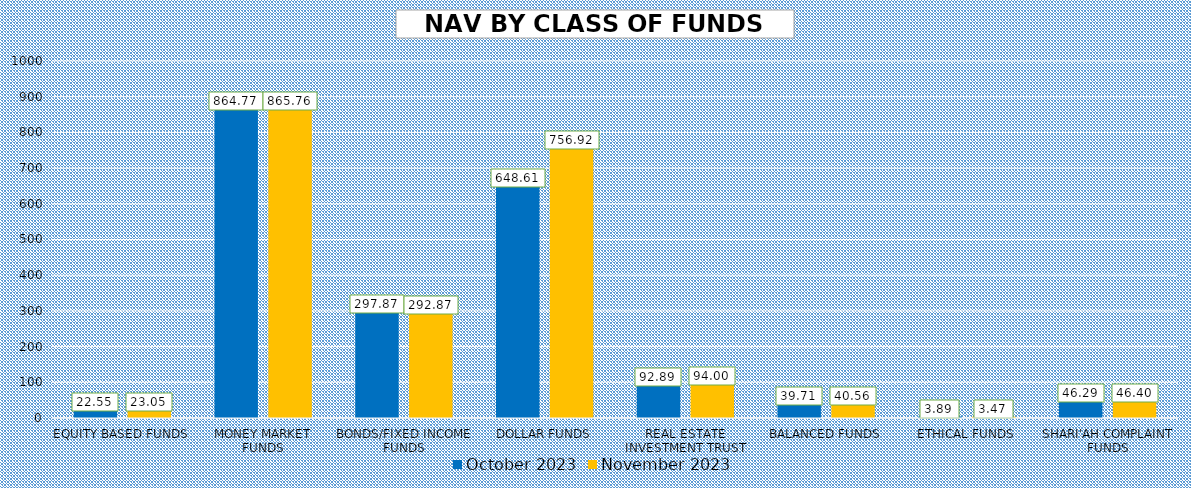
| Category | October 2023 | November 2023 |
|---|---|---|
| EQUITY BASED FUNDS | 22.548 | 23.047 |
| MONEY MARKET FUNDS | 864.77 | 865.757 |
| BONDS/FIXED INCOME FUNDS | 297.869 | 292.87 |
| DOLLAR FUNDS | 648.613 | 756.918 |
| REAL ESTATE INVESTMENT TRUST | 92.891 | 93.996 |
| BALANCED FUNDS | 39.715 | 40.559 |
| ETHICAL FUNDS | 3.894 | 3.472 |
| SHARI'AH COMPLAINT FUNDS | 46.293 | 46.398 |